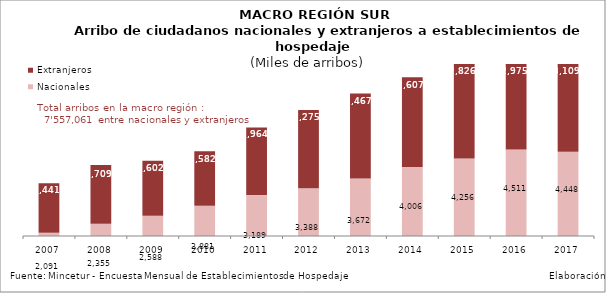
| Category | Nacionales | Extranjeros |
|---|---|---|
| 2007.0 | 2091.094 | 1440.827 |
| 2008.0 | 2354.57 | 1708.6 |
| 2009.0 | 2587.685 | 1602.262 |
| 2010.0 | 2881.363 | 1582.304 |
| 2011.0 | 3189.369 | 1963.919 |
| 2012.0 | 3388.447 | 2274.898 |
| 2013.0 | 3672.491 | 2466.648 |
| 2014.0 | 4006.225 | 2606.999 |
| 2015.0 | 4256.244 | 2826.381 |
| 2016.0 | 4511.477 | 2975.498 |
| 2017.0 | 4447.585 | 3109.476 |